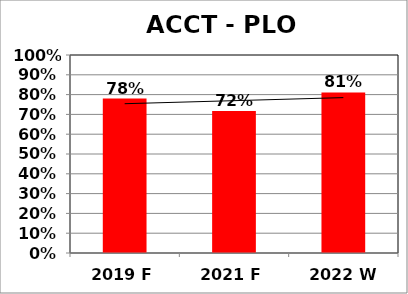
| Category | Series 0 |
|---|---|
| 2019 F | 0.78 |
| 2021 F | 0.717 |
| 2022 W | 0.811 |